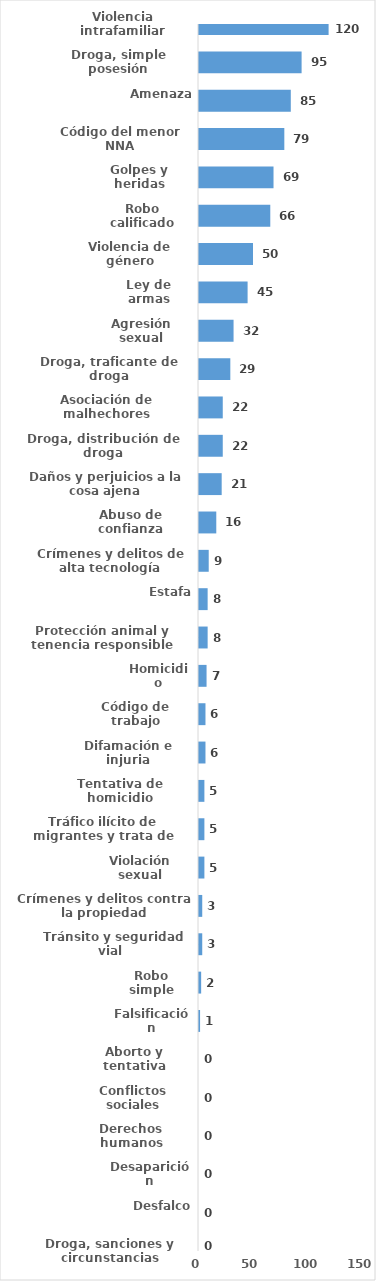
| Category | Series 0 |
|---|---|
| Violencia intrafamiliar | 120 |
| Droga, simple posesión | 95 |
| Amenaza | 85 |
| Código del menor NNA | 79 |
| Golpes y heridas | 69 |
| Robo calificado | 66 |
| Violencia de género | 50 |
| Ley de armas | 45 |
| Agresión sexual | 32 |
| Droga, traficante de droga | 29 |
| Asociación de malhechores | 22 |
| Droga, distribución de droga | 22 |
| Daños y perjuicios a la cosa ajena | 21 |
| Abuso de confianza | 16 |
| Crímenes y delitos de alta tecnología | 9 |
| Estafa | 8 |
| Protección animal y tenencia responsible | 8 |
| Homicidio | 7 |
| Código de trabajo | 6 |
| Difamación e injuria | 6 |
| Tentativa de homicidio | 5 |
| Tráfico ilícito de migrantes y trata de personas | 5 |
| Violación sexual | 5 |
| Crímenes y delitos contra la propiedad | 3 |
| Tránsito y seguridad vial  | 3 |
| Robo simple | 2 |
| Falsificación | 1 |
| Aborto y tentativa | 0 |
| Conflictos sociales | 0 |
| Derechos humanos | 0 |
| Desaparición | 0 |
| Desfalco | 0 |
| Droga, sanciones y circunstancias agravantes | 0 |